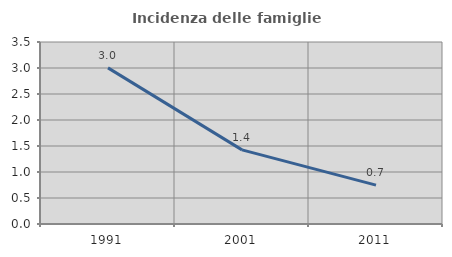
| Category | Incidenza delle famiglie numerose |
|---|---|
| 1991.0 | 3.003 |
| 2001.0 | 1.425 |
| 2011.0 | 0.747 |